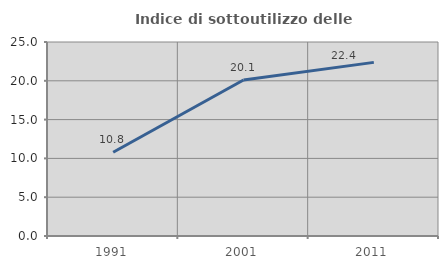
| Category | Indice di sottoutilizzo delle abitazioni  |
|---|---|
| 1991.0 | 10.79 |
| 2001.0 | 20.106 |
| 2011.0 | 22.374 |